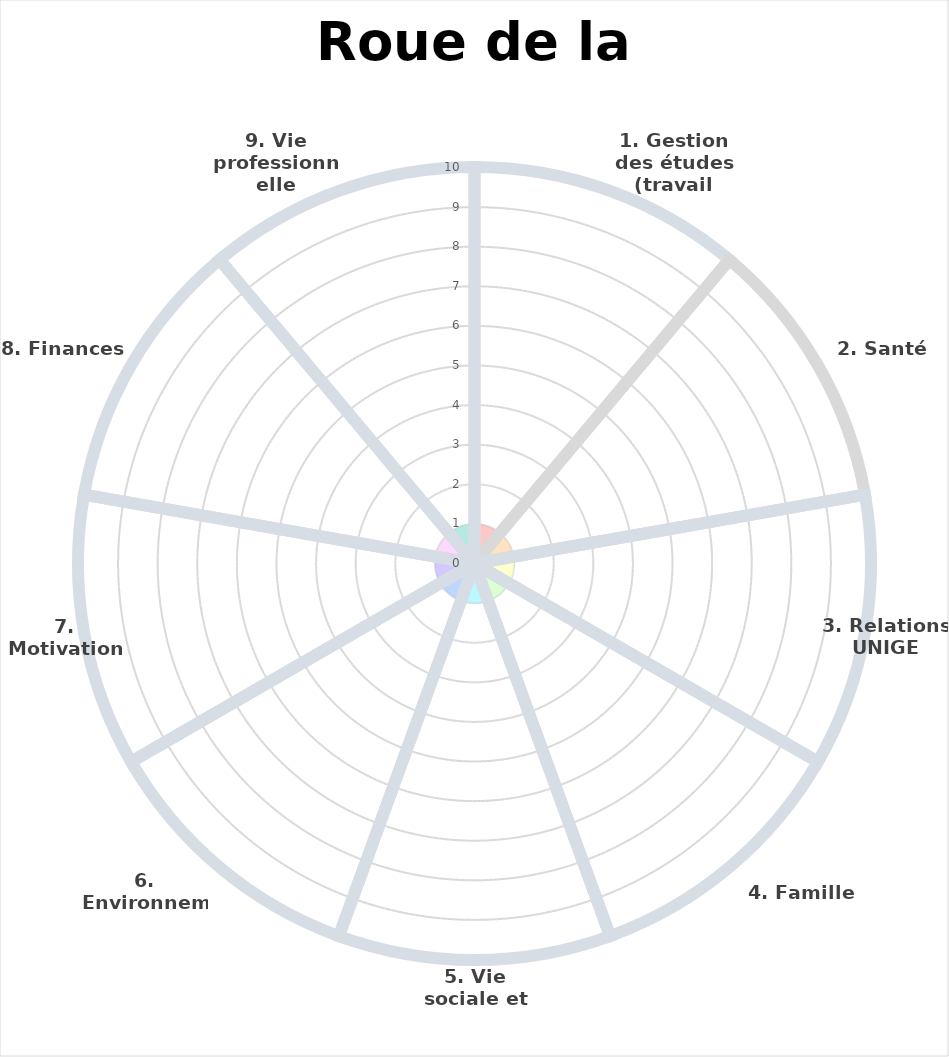
| Category | Sector Weight |
|---|---|
| 1. Gestion des études
(travail personnel et cours) | 1 |
| 2. Santé | 1 |
| 3. Relations UNIGE | 1 |
| 4. Famille | 1 |
| 5. Vie sociale et hobbies | 1 |
| 6. Environnement de vie | 1 |
| 7. Motivation | 1 |
| 8. Finances | 1 |
| 9. Vie professionnelle
(si applicable) | 1 |